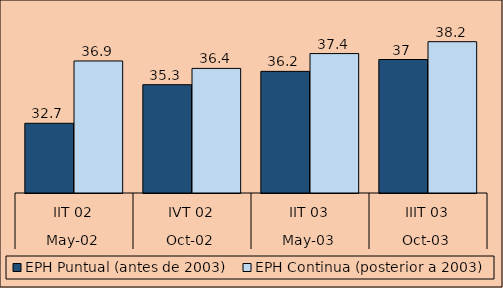
| Category | EPH Puntual (antes de 2003) | EPH Continua (posterior a 2003) |
|---|---|---|
| 0 | 32.7 | 36.9 |
| 1 | 35.3 | 36.4 |
| 2 | 36.2 | 37.4 |
| 3 | 37 | 38.2 |